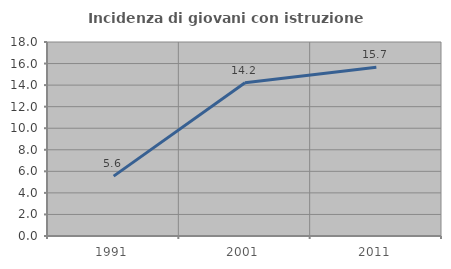
| Category | Incidenza di giovani con istruzione universitaria |
|---|---|
| 1991.0 | 5.556 |
| 2001.0 | 14.226 |
| 2011.0 | 15.663 |